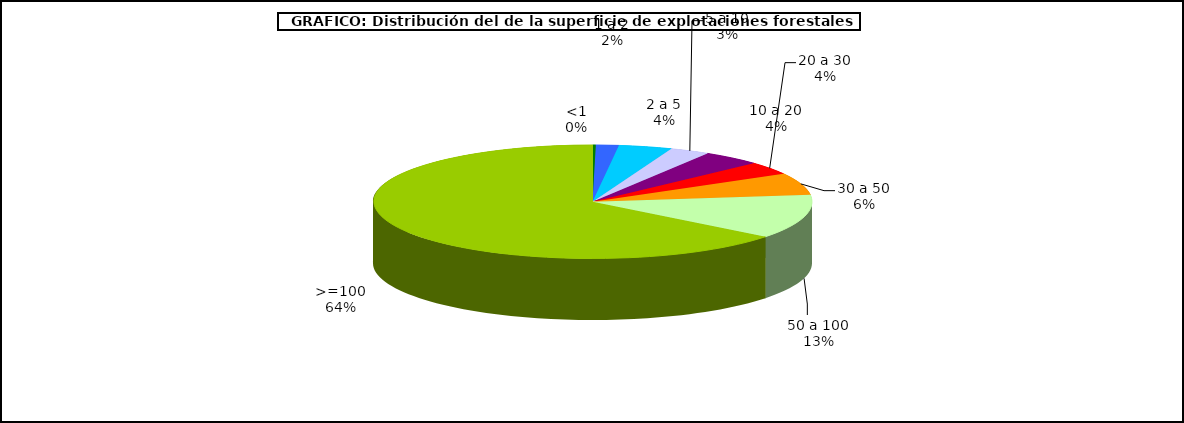
| Category | Series 0 |
|---|---|
| 0 | 11350 |
| 1 | 77998 |
| 2 | 183304 |
| 3 | 136774 |
| 4 | 202347 |
| 5 | 171072 |
| 6 | 290731 |
| 7 | 585617 |
| 8 | 3005705 |